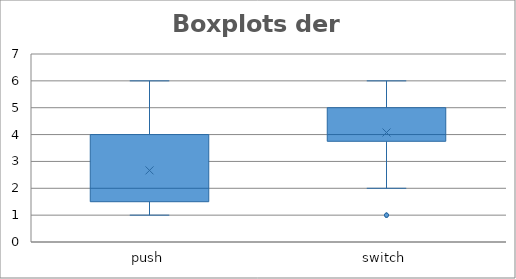
| Category | Häufigkeit |
|---|---|
| 1.5 | 5 |
| 2 | 8 |
| 4 | 6 |
| und größer | 2 |